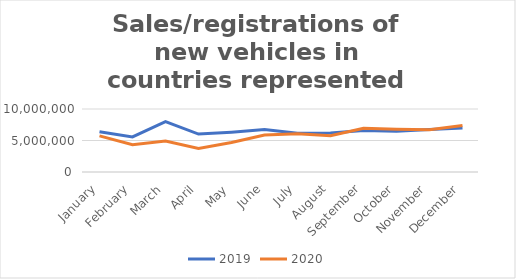
| Category | 2019 | 2020 |
|---|---|---|
| January | 6374305 | 5731762 |
| February | 5562849 | 4322879 |
| March | 7998475 | 4911671 |
| April | 6021155 | 3749747 |
| May | 6324725 | 4683332 |
| June | 6744570 | 5866013 |
| July | 6148229 | 6088226 |
| August | 6190980 | 5759638 |
| September | 6593130 | 6954540 |
| October | 6463877 | 6789108 |
| November | 6739974 | 6692247 |
| December | 6994485.225 | 7394747 |